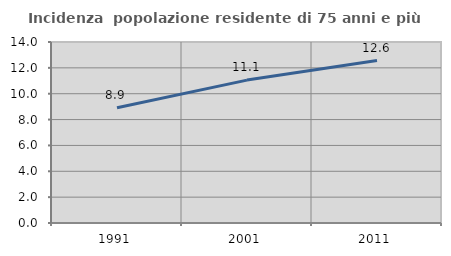
| Category | Incidenza  popolazione residente di 75 anni e più |
|---|---|
| 1991.0 | 8.912 |
| 2001.0 | 11.053 |
| 2011.0 | 12.567 |